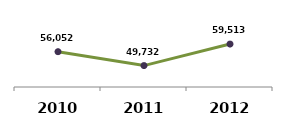
| Category | Series 0 |
|---|---|
| 2010.0 | 56052 |
| 2011.0 | 49732 |
| 2012.0 | 59513 |